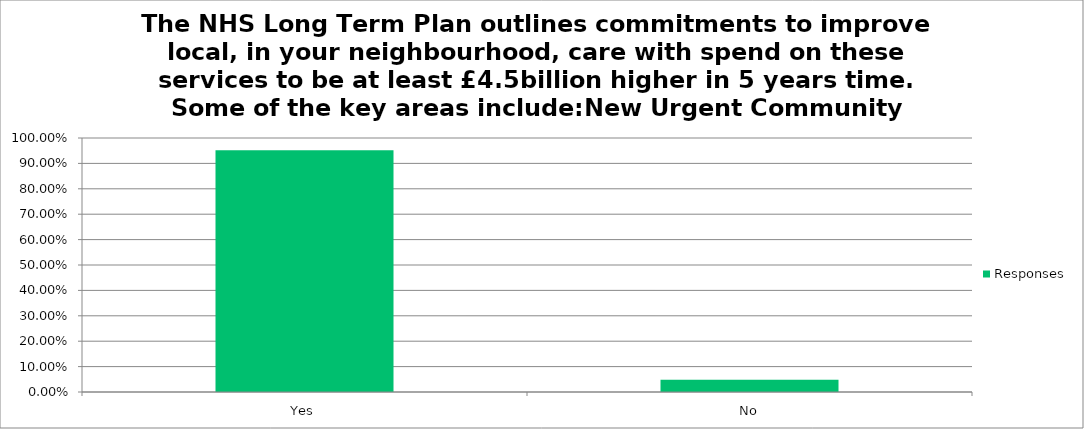
| Category | Responses |
|---|---|
| Yes | 0.951 |
| No | 0.049 |